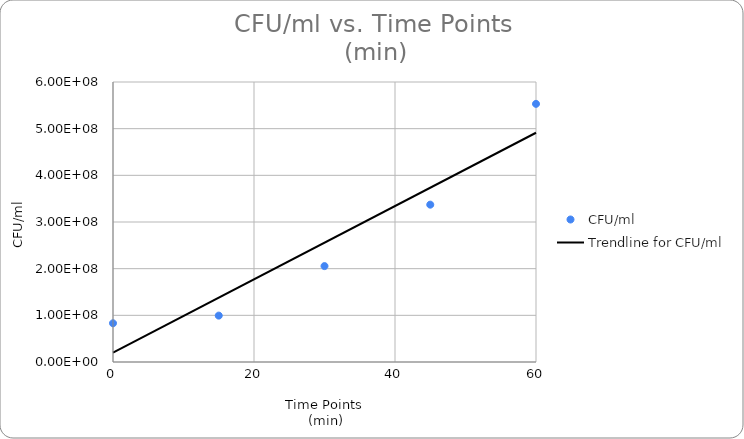
| Category | CFU/ml |
|---|---|
| 0.0 | 83000000 |
| 15.0 | 99408238.441 |
| 30.0 | 205501193.532 |
| 45.0 | 337159789.513 |
| 60.0 | 553168191.923 |